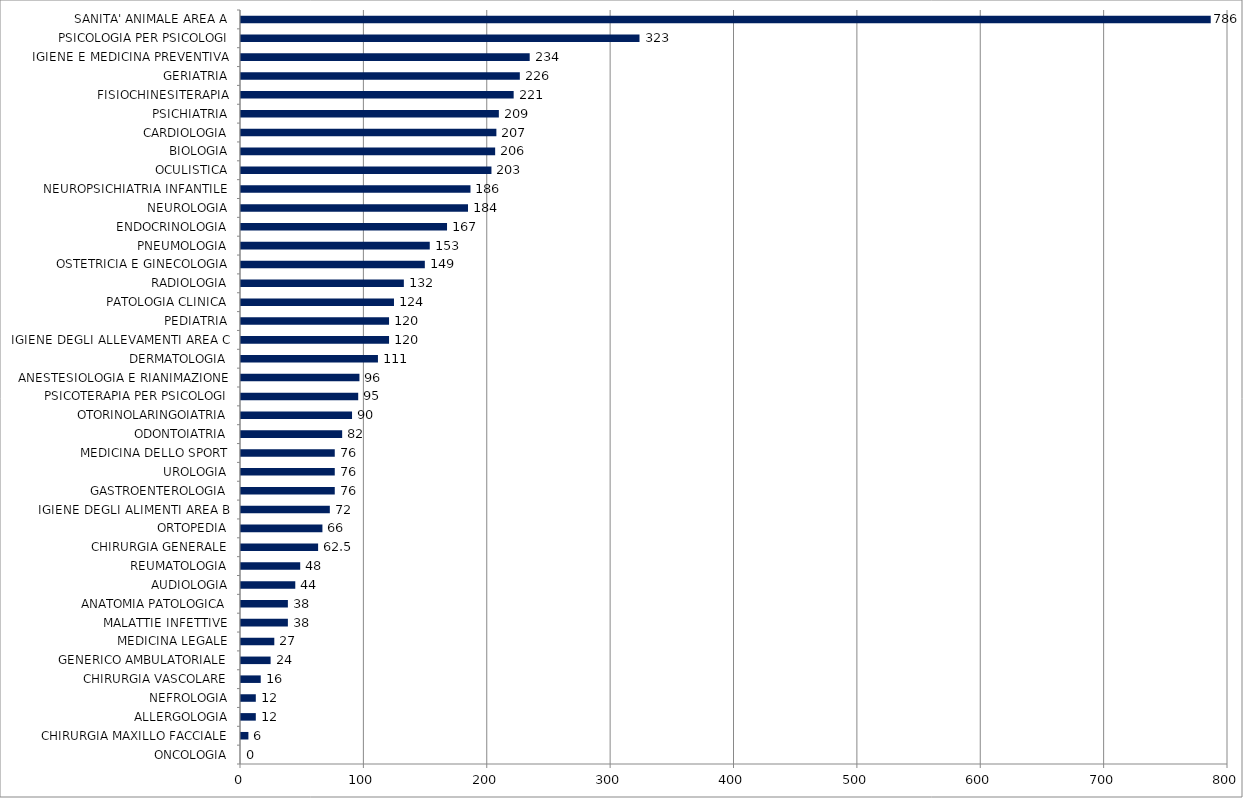
| Category | Series 0 |
|---|---|
| ONCOLOGIA | 0 |
| CHIRURGIA MAXILLO FACCIALE | 6 |
| ALLERGOLOGIA | 12 |
| NEFROLOGIA | 12 |
| CHIRURGIA VASCOLARE | 16 |
| GENERICO AMBULATORIALE | 24 |
| MEDICINA LEGALE | 27 |
| MALATTIE INFETTIVE | 38 |
| ANATOMIA PATOLOGICA | 38 |
| AUDIOLOGIA | 44 |
| REUMATOLOGIA | 48 |
| CHIRURGIA GENERALE | 62.5 |
| ORTOPEDIA | 66 |
| IGIENE DEGLI ALIMENTI AREA B | 72 |
| GASTROENTEROLOGIA | 76 |
| UROLOGIA | 76 |
| MEDICINA DELLO SPORT | 76 |
| ODONTOIATRIA | 82 |
| OTORINOLARINGOIATRIA | 90 |
| PSICOTERAPIA PER PSICOLOGI | 95 |
| ANESTESIOLOGIA E RIANIMAZIONE | 96 |
| DERMATOLOGIA | 111 |
| IGIENE DEGLI ALLEVAMENTI AREA C | 120 |
| PEDIATRIA | 120 |
| PATOLOGIA CLINICA | 124 |
| RADIOLOGIA | 132 |
| OSTETRICIA E GINECOLOGIA | 149 |
| PNEUMOLOGIA | 153 |
| ENDOCRINOLOGIA | 167 |
| NEUROLOGIA | 184 |
| NEUROPSICHIATRIA INFANTILE | 186 |
| OCULISTICA | 203 |
| BIOLOGIA | 206 |
| CARDIOLOGIA | 207 |
| PSICHIATRIA | 209 |
| FISIOCHINESITERAPIA | 221 |
| GERIATRIA | 226 |
| IGIENE E MEDICINA PREVENTIVA | 234 |
| PSICOLOGIA PER PSICOLOGI | 323 |
| SANITA' ANIMALE AREA A | 786 |